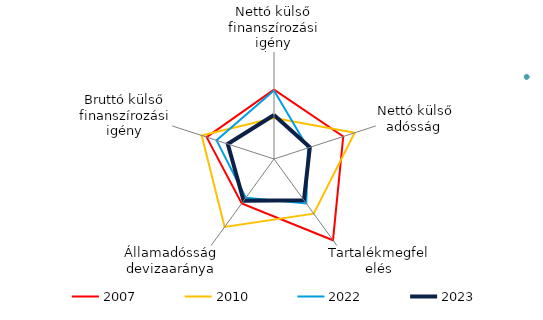
| Category | 2007 | 2008 | 2010 | 2022 | 2023 |
|---|---|---|---|---|---|
| Nettó külső finanszírozási igény | 0.89 |  | -0.701 | 0.843 | -0.536 |
| Nettó külső adósság  | 1.082 |  | 1.757 | -0.995 | -0.887 |
| Tartalékmegfelelés | 2.628 |  | 0.789 | 0.078 | -0.145 |
| Államadósság devizaaránya | 0.078 |  | 1.712 | -0.312 | -0.104 |
| Bruttó külső finanszírozási igény | 0.973 |  | 1.263 | 0.386 | -0.275 |